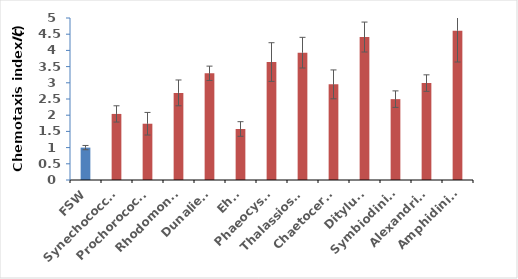
| Category | Series 0 |
|---|---|
| FSW | 1 |
| Synechococcus | 2.039 |
| Prochorococcus | 1.737 |
| Rhodomonas | 2.689 |
| Dunaliella | 3.294 |
| Ehux | 1.575 |
| Phaeocystis | 3.64 |
| Thalassiosira | 3.93 |
| Chaetoceros | 2.952 |
| Ditylum | 4.412 |
| Symbiodinium | 2.496 |
| Alexandrium | 2.991 |
| Amphidinium | 4.61 |